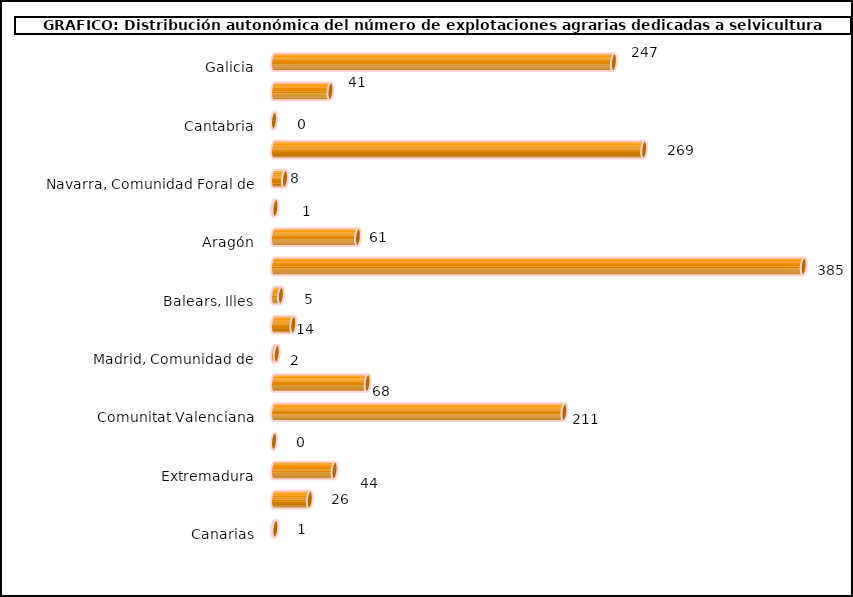
| Category | Series 0 |
|---|---|
| Galicia | 247 |
| Asturias, Principado de | 41 |
| Cantabria | 0 |
| País Vasco | 269 |
| Navarra, Comunidad Foral de | 8 |
| Rioja, La | 1 |
| Aragón | 61 |
| Cataluña | 385 |
| Balears, Illes | 5 |
| Castilla y León | 14 |
| Madrid, Comunidad de | 2 |
| Castilla - La Mancha | 68 |
| Comunitat Valenciana | 211 |
| Murcia, Región de | 0 |
| Extremadura | 44 |
| Andalucía | 26 |
| Canarias | 1 |